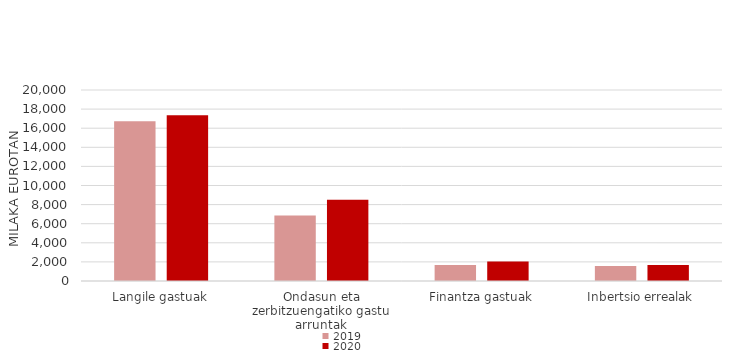
| Category | 2019 | 2020 |
|---|---|---|
| Langile gastuak | 16718.03 | 17356.56 |
| Ondasun eta zerbitzuengatiko gastu arruntak | 6859.08 | 8510.48 |
| Finantza gastuak | 1686.22 | 2037.8 |
| Inbertsio errealak | 1568.63 | 1666.93 |